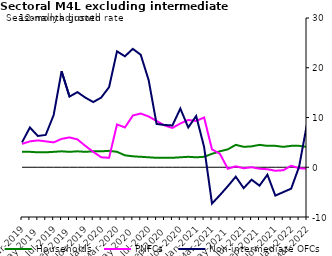
| Category | zero | Households | PNFCs | Non-intermediate OFCs |
|---|---|---|---|---|
| Mar-2019 | 0 | 3.1 | 4.7 | 5 |
| Apr-2019 | 0 | 3.1 | 5.2 | 8 |
| May-2019 | 0 | 3 | 5.4 | 6.3 |
| Jun-2019 | 0 | 3 | 5.2 | 6.5 |
| Jul-2019 | 0 | 3.1 | 5 | 10.5 |
| Aug-2019 | 0 | 3.2 | 5.7 | 19.3 |
| Sep-2019 | 0 | 3.1 | 6 | 14.2 |
| Oct-2019 | 0 | 3.2 | 5.6 | 15.1 |
| Nov-2019 | 0 | 3.1 | 4.3 | 14 |
| Dec-2019 | 0 | 3.2 | 3.1 | 13.1 |
| Jan-2020 | 0 | 3.2 | 2 | 14 |
| Feb-2020 | 0 | 3.3 | 1.9 | 16.1 |
| Mar-2020 | 0 | 3.1 | 8.6 | 23.3 |
| Apr-2020 | 0 | 2.4 | 8 | 22.3 |
| May-2020 | 0 | 2.2 | 10.4 | 23.8 |
| Jun-2020 | 0 | 2.1 | 10.8 | 22.6 |
| Jul-2020 | 0 | 2 | 10.2 | 17.5 |
| Aug-2020 | 0 | 1.9 | 9.3 | 8.7 |
| Sep-2020 | 0 | 1.9 | 8.4 | 8.5 |
| Oct-2020 | 0 | 1.9 | 7.9 | 8.4 |
| Nov-2020 | 0 | 2 | 8.8 | 11.8 |
| Dec-2020 | 0 | 2.1 | 9.5 | 8 |
| Jan-2021 | 0 | 2 | 9.3 | 10.3 |
| Feb-2021 | 0 | 2.1 | 10 | 4.1 |
| Mar-2021 | 0 | 2.7 | 3.6 | -7.3 |
| Apr-2021 | 0 | 3.2 | 2.7 | -5.6 |
| May-2021 | 0 | 3.6 | -0.3 | -3.8 |
| Jun-2021 | 0 | 4.5 | 0.2 | -1.9 |
| Jul-2021 | 0 | 4.1 | -0.2 | -4.2 |
| Aug-2021 | 0 | 4.2 | 0 | -2.5 |
| Sep-2021 | 0 | 4.5 | -0.3 | -3.7 |
| Oct-2021 | 0 | 4.3 | -0.4 | -1.5 |
| Nov-2021 | 0 | 4.3 | -0.7 | -5.7 |
| Dec-2021 | 0 | 4.1 | -0.6 | -5 |
| Jan-2022 | 0 | 4.3 | 0.3 | -4.3 |
| Feb-2022 | 0 | 4.3 | -0.2 | 0.1 |
| Mar-2022 | 0 | 4.1 | -0.3 | 8.7 |